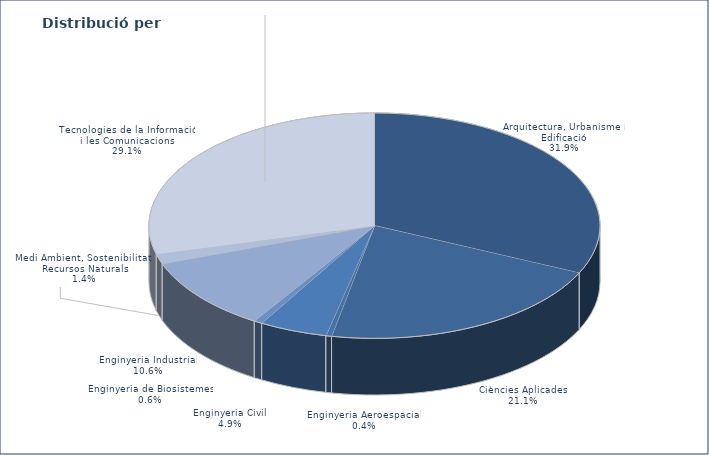
| Category | Series 0 |
|---|---|
| Arquitectura, Urbanisme i Edificació | 157 |
| Ciències Aplicades | 104 |
| Enginyeria Aeroespacial | 2 |
| Enginyeria Civil | 24 |
| Enginyeria de Biosistemes | 3 |
| Enginyeria Industrial | 52 |
| Medi Ambient, Sostenibilitat i Recursos Naturals | 7 |
| Tecnologies de la Informació i les Comunicacions | 143 |